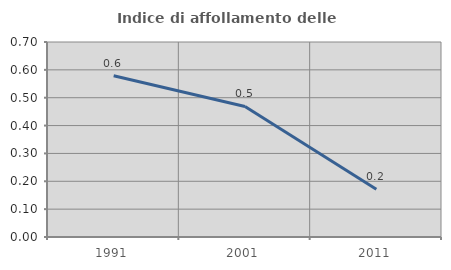
| Category | Indice di affollamento delle abitazioni  |
|---|---|
| 1991.0 | 0.579 |
| 2001.0 | 0.469 |
| 2011.0 | 0.171 |